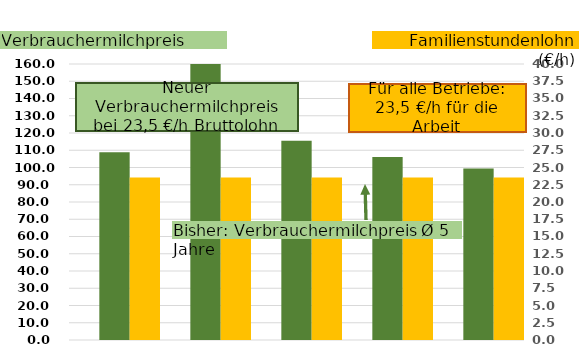
| Category | Milchpreis |
|---|---|
| Bayern 
Ø 53 Kühe | 108.796 |
| 19 Kühe | 166.084 |
| 39 Kühe | 115.512 |
| 60 Kühe | 106.054 |
| 93 Kühe | 99.437 |